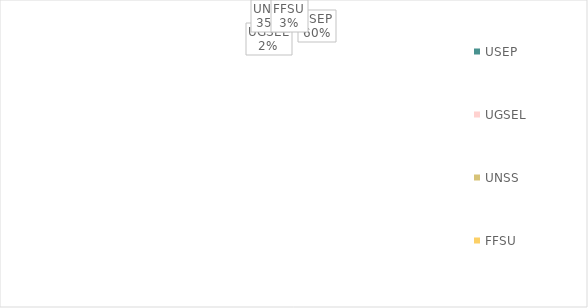
| Category | Series 0 |
|---|---|
| USEP | 149 |
| UGSEL | 5 |
| UNSS | 88 |
| FFSU | 8 |